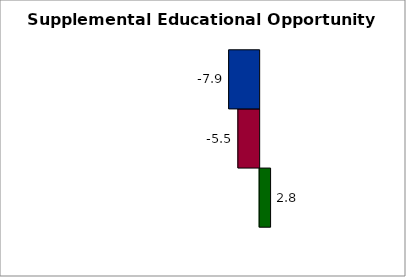
| Category | State | SREB states | 50 states and D.C. |
|---|---|---|---|
| 0 | 2.818 | -5.487 | -7.871 |